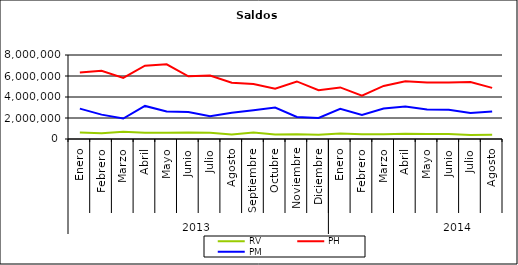
| Category | RV | PH | PM |
|---|---|---|---|
| 0 | 625726.624 | 6338490.057 | 2894951.851 |
| 1 | 552164.14 | 6505711.807 | 2320902.81 |
| 2 | 684317.675 | 5822855.149 | 1948127.804 |
| 3 | 601474.166 | 6976391.987 | 3151453.143 |
| 4 | 590050.657 | 7107878.906 | 2620515.735 |
| 5 | 624993.58 | 5975534.656 | 2574055.31 |
| 6 | 600696.535 | 6050025.472 | 2173848.831 |
| 7 | 419012.816 | 5367684.924 | 2503871.717 |
| 8 | 611730.758 | 5247250.768 | 2727549.288 |
| 9 | 419155.215 | 4784420.625 | 2990459.774 |
| 10 | 447319.577 | 5481772.72 | 2092491.866 |
| 11 | 408611.698 | 4646492.747 | 1999878.157 |
| 12 | 527889.485 | 4912075.273 | 2877652.76 |
| 13 | 454567.098 | 4120538.063 | 2278357.683 |
| 14 | 451499.2 | 5057360.029 | 2895505.472 |
| 15 | 496328.639 | 5498657.25 | 3083378.882 |
| 16 | 484463.452 | 5384146.137 | 2812191.042 |
| 17 | 465266.869 | 5373295.415 | 2775261.669 |
| 18 | 390003.439 | 5435984.925 | 2470327.976 |
| 19 | 403145.138 | 4872387.208 | 2622344.549 |